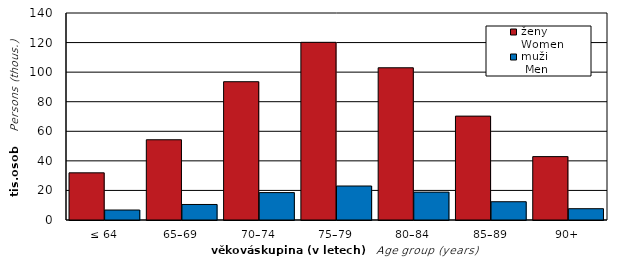
| Category | ženy  
Women | muži 
 Men |
|---|---|---|
| ≤ 64 | 31902 | 6749 |
| 65–69 | 54272 | 10500 |
| 70–74 | 93531 | 18535 |
| 75–79 | 120169 | 22992 |
| 80–84 | 102956 | 18857 |
| 85–89 | 70255 | 12364 |
| 90+ | 42864 | 7642 |